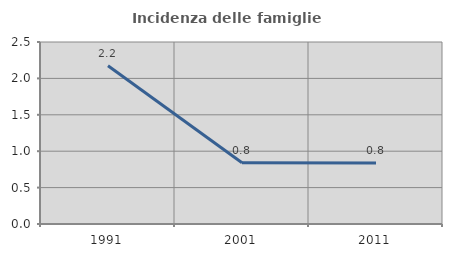
| Category | Incidenza delle famiglie numerose |
|---|---|
| 1991.0 | 2.174 |
| 2001.0 | 0.84 |
| 2011.0 | 0.837 |